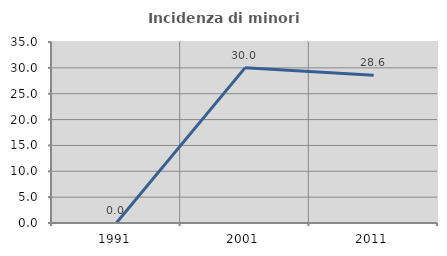
| Category | Incidenza di minori stranieri |
|---|---|
| 1991.0 | 0 |
| 2001.0 | 30 |
| 2011.0 | 28.571 |